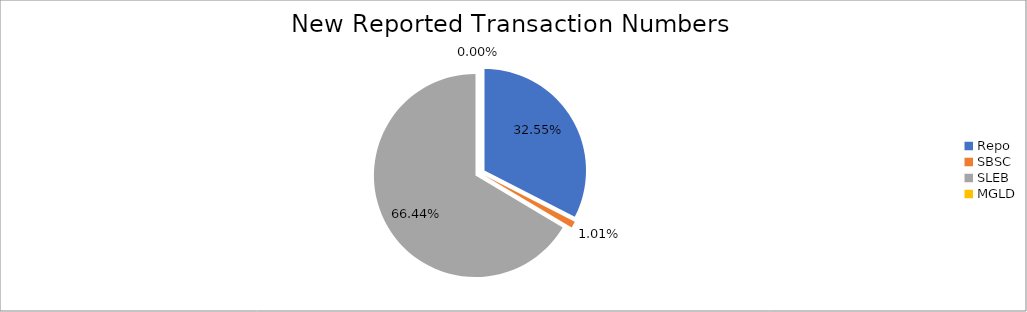
| Category | Series 0 |
|---|---|
| Repo | 279245 |
| SBSC | 8631 |
| SLEB | 570035 |
| MGLD | 11 |